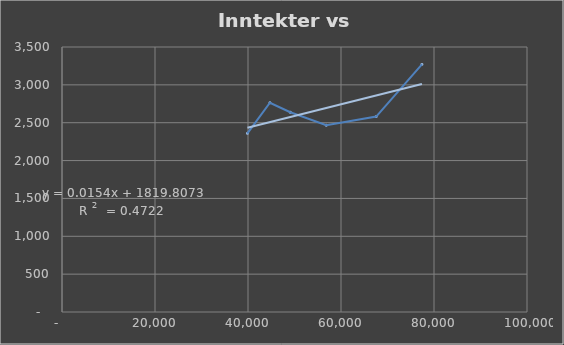
| Category | Inntekter |
|---|---|
| 39875.0 | 2360 |
| 44714.0 | 2764 |
| 49095.0 | 2638 |
| 56834.0 | 2466 |
| 67568.0 | 2581 |
| 77404.0 | 3270 |